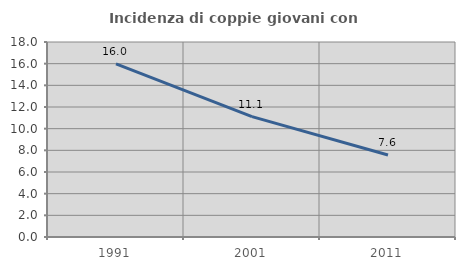
| Category | Incidenza di coppie giovani con figli |
|---|---|
| 1991.0 | 15.976 |
| 2001.0 | 11.111 |
| 2011.0 | 7.569 |